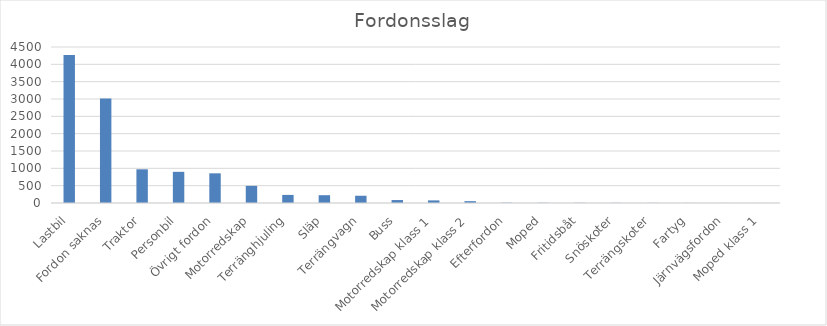
| Category | Summa |
|---|---|
| Lastbil | 4267 |
| Fordon saknas | 3012 |
| Traktor | 972 |
| Personbil | 899 |
| Övrigt fordon | 856 |
| Motorredskap | 495 |
| Terränghjuling | 233 |
| Släp | 225 |
| Terrängvagn | 209 |
| Buss | 85 |
| Motorredskap klass 1 | 75 |
| Motorredskap klass 2 | 53 |
| Efterfordon | 8 |
| Moped | 6 |
| Fritidsbåt | 5 |
| Snöskoter | 4 |
| Terrängskoter | 3 |
| Fartyg | 2 |
| Järnvägsfordon | 1 |
| Moped klass 1 | 1 |